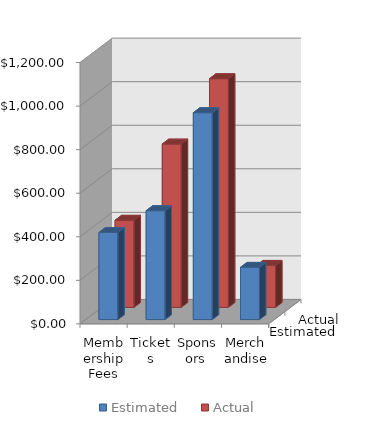
| Category | Estimated | Actual |
|---|---|---|
| Membership Fees this month  | 400 | 400 |
| Tickets | 500 | 750 |
| Sponsors  | 950 | 1050 |
| Merchandise  | 240 | 193 |